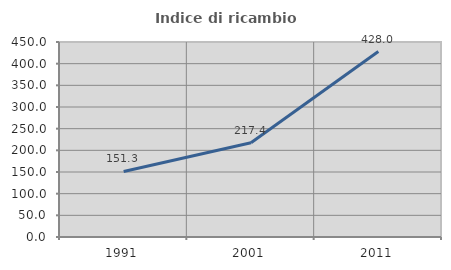
| Category | Indice di ricambio occupazionale  |
|---|---|
| 1991.0 | 151.316 |
| 2001.0 | 217.391 |
| 2011.0 | 428 |